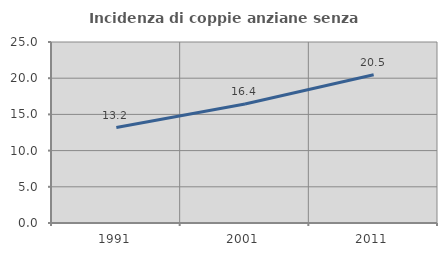
| Category | Incidenza di coppie anziane senza figli  |
|---|---|
| 1991.0 | 13.183 |
| 2001.0 | 16.447 |
| 2011.0 | 20.478 |